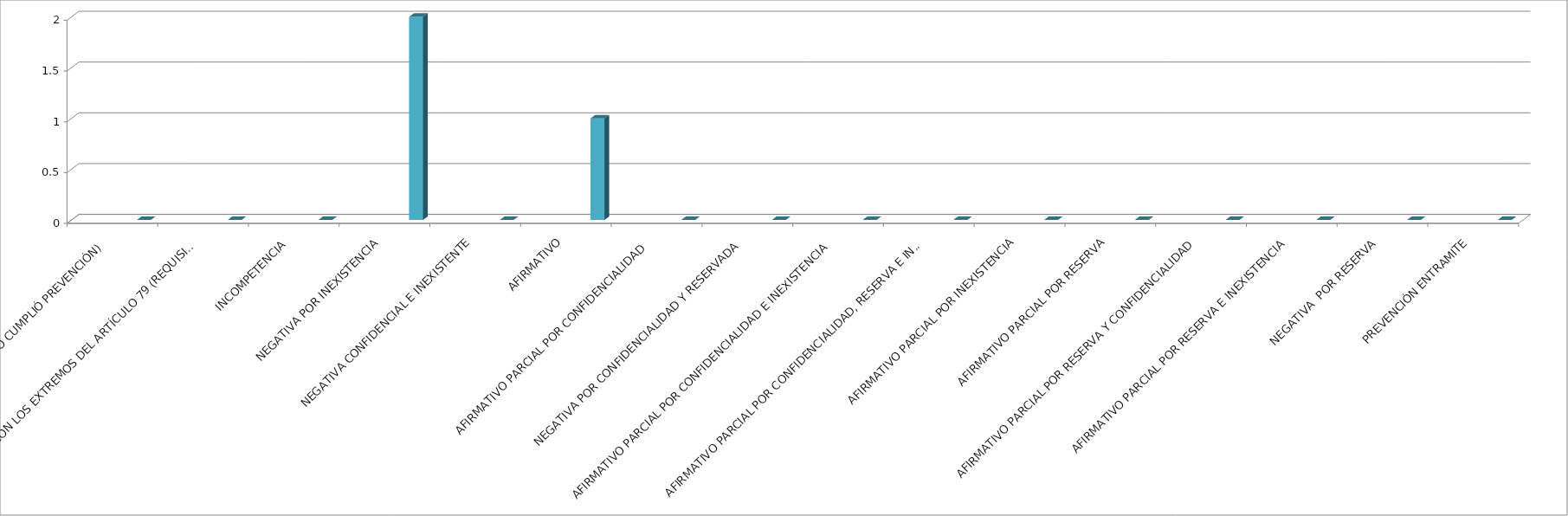
| Category | Series 0 | Series 1 | Series 2 | Series 3 | Series 4 |
|---|---|---|---|---|---|
| SE TIENE POR NO PRESENTADA ( NO CUMPLIÓ PREVENCIÓN) |  |  |  |  | 0 |
| NO CUMPLIO CON LOS EXTREMOS DEL ARTÍCULO 79 (REQUISITOS) |  |  |  |  | 0 |
| INCOMPETENCIA  |  |  |  |  | 0 |
| NEGATIVA POR INEXISTENCIA |  |  |  |  | 2 |
| NEGATIVA CONFIDENCIAL E INEXISTENTE |  |  |  |  | 0 |
| AFIRMATIVO |  |  |  |  | 1 |
| AFIRMATIVO PARCIAL POR CONFIDENCIALIDAD  |  |  |  |  | 0 |
| NEGATIVA POR CONFIDENCIALIDAD Y RESERVADA |  |  |  |  | 0 |
| AFIRMATIVO PARCIAL POR CONFIDENCIALIDAD E INEXISTENCIA |  |  |  |  | 0 |
| AFIRMATIVO PARCIAL POR CONFIDENCIALIDAD, RESERVA E INEXISTENCIA |  |  |  |  | 0 |
| AFIRMATIVO PARCIAL POR INEXISTENCIA |  |  |  |  | 0 |
| AFIRMATIVO PARCIAL POR RESERVA |  |  |  |  | 0 |
| AFIRMATIVO PARCIAL POR RESERVA Y CONFIDENCIALIDAD |  |  |  |  | 0 |
| AFIRMATIVO PARCIAL POR RESERVA E INEXISTENCIA |  |  |  |  | 0 |
| NEGATIVA  POR RESERVA |  |  |  |  | 0 |
| PREVENCIÓN ENTRAMITE |  |  |  |  | 0 |